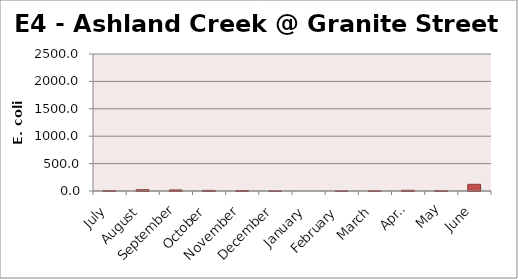
| Category | E. coli MPN |
|---|---|
| July | 5.2 |
| August | 23.3 |
| September | 19.7 |
| October | 10.9 |
| November | 7.4 |
| December | 1 |
| January | 0 |
| February | 1 |
| March | 2 |
| April | 13.4 |
| May | 4.1 |
| June | 122.3 |